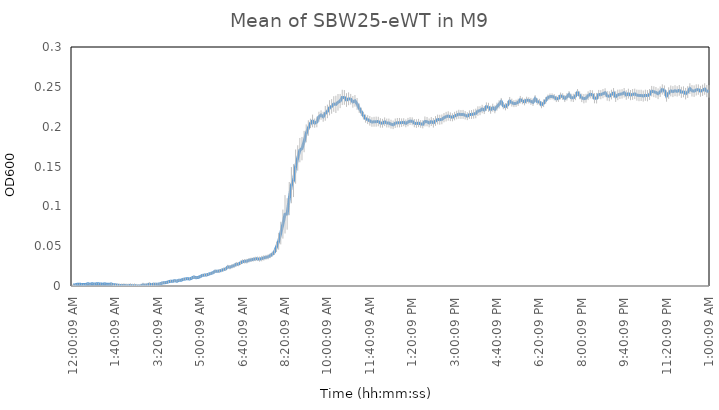
| Category | SBW25 (WT) |
|---|---|
| 0.00010416666666666667 | 0.001 |
| 0.0035763888888888894 | 0.001 |
| 0.0070486111111111105 | 0.002 |
| 0.010520833333333333 | 0.002 |
| 0.013993055555555555 | 0.002 |
| 0.017465277777777777 | 0.002 |
| 0.020937499999999998 | 0.002 |
| 0.02440972222222222 | 0.003 |
| 0.027881944444444445 | 0.002 |
| 0.03135416666666666 | 0.003 |
| 0.034826388888888886 | 0.002 |
| 0.03829861111111111 | 0.003 |
| 0.04177083333333333 | 0.003 |
| 0.04524305555555556 | 0.003 |
| 0.04871527777777778 | 0.002 |
| 0.0521875 | 0.003 |
| 0.05565972222222223 | 0.002 |
| 0.059131944444444445 | 0.002 |
| 0.06260416666666667 | 0.003 |
| 0.06607638888888889 | 0.001 |
| 0.06954861111111112 | 0.001 |
| 0.07302083333333333 | 0.001 |
| 0.07649305555555556 | 0.001 |
| 0.07996527777777777 | 0.001 |
| 0.0834375 | 0.001 |
| 0.08690972222222222 | 0 |
| 0.09038194444444443 | 0 |
| 0.09385416666666667 | 0.001 |
| 0.09732638888888889 | 0 |
| 0.1007986111111111 | 0 |
| 0.10427083333333333 | 0 |
| 0.10774305555555556 | 0 |
| 0.11121527777777777 | 0 |
| 0.1146875 | 0.001 |
| 0.11815972222222222 | 0.001 |
| 0.12163194444444443 | 0.001 |
| 0.12510416666666666 | 0.002 |
| 0.1285763888888889 | 0.002 |
| 0.1320486111111111 | 0.002 |
| 0.13552083333333334 | 0.002 |
| 0.13899305555555555 | 0.002 |
| 0.14246527777777776 | 0.003 |
| 0.1459375 | 0.004 |
| 0.14940972222222224 | 0.004 |
| 0.15288194444444445 | 0.004 |
| 0.15635416666666666 | 0.005 |
| 0.1598263888888889 | 0.006 |
| 0.1632986111111111 | 0.006 |
| 0.16677083333333334 | 0.007 |
| 0.17024305555555555 | 0.006 |
| 0.17371527777777776 | 0.007 |
| 0.17718750000000003 | 0.007 |
| 0.18065972222222224 | 0.008 |
| 0.18413194444444445 | 0.009 |
| 0.18760416666666666 | 0.009 |
| 0.1910763888888889 | 0.009 |
| 0.1945486111111111 | 0.01 |
| 0.1980208333333333 | 0.011 |
| 0.20149305555555555 | 0.01 |
| 0.20496527777777776 | 0.011 |
| 0.20843750000000003 | 0.012 |
| 0.21190972222222224 | 0.013 |
| 0.21538194444444445 | 0.014 |
| 0.21885416666666668 | 0.014 |
| 0.2223263888888889 | 0.015 |
| 0.2257986111111111 | 0.016 |
| 0.2292708333333333 | 0.017 |
| 0.23274305555555555 | 0.018 |
| 0.23621527777777776 | 0.018 |
| 0.23968749999999997 | 0.019 |
| 0.24315972222222224 | 0.02 |
| 0.24663194444444445 | 0.021 |
| 0.2501041666666667 | 0.021 |
| 0.2535763888888889 | 0.024 |
| 0.2570486111111111 | 0.024 |
| 0.26052083333333337 | 0.025 |
| 0.2639930555555556 | 0.026 |
| 0.2674652777777778 | 0.027 |
| 0.27092592592592596 | 0.027 |
| 0.2744097222222222 | 0.029 |
| 0.2778819444444444 | 0.031 |
| 0.2813541666666666 | 0.031 |
| 0.2848263888888889 | 0.031 |
| 0.2882986111111111 | 0.032 |
| 0.29177083333333337 | 0.033 |
| 0.2952430555555556 | 0.033 |
| 0.2987152777777778 | 0.034 |
| 0.3021875 | 0.034 |
| 0.3056597222222222 | 0.034 |
| 0.3091319444444444 | 0.034 |
| 0.3126041666666666 | 0.035 |
| 0.3160763888888889 | 0.036 |
| 0.3195486111111111 | 0.037 |
| 0.3230208333333333 | 0.038 |
| 0.3264930555555556 | 0.04 |
| 0.3299652777777778 | 0.043 |
| 0.3334375 | 0.049 |
| 0.3369097222222222 | 0.056 |
| 0.3403819444444445 | 0.066 |
| 0.3438541666666666 | 0.078 |
| 0.3473263888888889 | 0.09 |
| 0.35079861111111116 | 0.09 |
| 0.3542708333333333 | 0.11 |
| 0.3577430555555556 | 0.127 |
| 0.3612152777777778 | 0.132 |
| 0.3646875 | 0.15 |
| 0.3681597222222222 | 0.161 |
| 0.3716319444444445 | 0.171 |
| 0.3751041666666666 | 0.172 |
| 0.3785763888888889 | 0.181 |
| 0.38204861111111116 | 0.192 |
| 0.3855208333333333 | 0.198 |
| 0.3889930555555556 | 0.204 |
| 0.3924652777777778 | 0.207 |
| 0.3959375 | 0.204 |
| 0.3994097222222222 | 0.206 |
| 0.4028819444444445 | 0.212 |
| 0.4063541666666666 | 0.215 |
| 0.4098263888888889 | 0.212 |
| 0.41329861111111116 | 0.217 |
| 0.4167708333333333 | 0.219 |
| 0.4202430555555556 | 0.224 |
| 0.4237152777777778 | 0.225 |
| 0.4271875 | 0.228 |
| 0.4306597222222222 | 0.228 |
| 0.4341319444444445 | 0.231 |
| 0.4376041666666666 | 0.232 |
| 0.4410763888888889 | 0.237 |
| 0.44454861111111116 | 0.237 |
| 0.4480208333333333 | 0.233 |
| 0.4514930555555556 | 0.235 |
| 0.4549652777777778 | 0.234 |
| 0.4584375 | 0.231 |
| 0.4619097222222222 | 0.232 |
| 0.4653819444444445 | 0.229 |
| 0.4688541666666666 | 0.223 |
| 0.4723263888888889 | 0.219 |
| 0.47579861111111116 | 0.214 |
| 0.4792708333333333 | 0.21 |
| 0.4827430555555556 | 0.209 |
| 0.4862152777777778 | 0.207 |
| 0.4896875 | 0.206 |
| 0.4931597222222222 | 0.206 |
| 0.4966319444444445 | 0.206 |
| 0.5001041666666667 | 0.206 |
| 0.5035763888888889 | 0.205 |
| 0.5070486111111111 | 0.204 |
| 0.5105208333333333 | 0.206 |
| 0.5139930555555555 | 0.205 |
| 0.5174652777777778 | 0.205 |
| 0.5209374999999999 | 0.203 |
| 0.5244097222222223 | 0.202 |
| 0.5278819444444445 | 0.204 |
| 0.5313541666666667 | 0.205 |
| 0.5348263888888889 | 0.205 |
| 0.5382986111111111 | 0.205 |
| 0.5417708333333333 | 0.206 |
| 0.5452430555555555 | 0.204 |
| 0.5487152777777778 | 0.206 |
| 0.5521874999999999 | 0.207 |
| 0.5556597222222223 | 0.207 |
| 0.5591319444444445 | 0.204 |
| 0.5626041666666667 | 0.204 |
| 0.5660763888888889 | 0.205 |
| 0.5695486111111111 | 0.203 |
| 0.5730208333333333 | 0.203 |
| 0.5764930555555555 | 0.207 |
| 0.5799652777777778 | 0.206 |
| 0.5834374999999999 | 0.205 |
| 0.5869097222222223 | 0.206 |
| 0.5903819444444445 | 0.205 |
| 0.5938541666666667 | 0.207 |
| 0.5973263888888889 | 0.209 |
| 0.6007986111111111 | 0.209 |
| 0.6042708333333333 | 0.209 |
| 0.6077430555555555 | 0.211 |
| 0.6112152777777778 | 0.213 |
| 0.6146874999999999 | 0.213 |
| 0.6181597222222223 | 0.212 |
| 0.6216319444444445 | 0.212 |
| 0.6251041666666667 | 0.213 |
| 0.6285763888888889 | 0.215 |
| 0.6320486111111111 | 0.216 |
| 0.6355208333333333 | 0.215 |
| 0.6389930555555555 | 0.215 |
| 0.6424652777777778 | 0.214 |
| 0.6459374999999999 | 0.213 |
| 0.6494097222222223 | 0.215 |
| 0.6528819444444445 | 0.215 |
| 0.6563541666666667 | 0.216 |
| 0.6598263888888889 | 0.217 |
| 0.6632986111111111 | 0.22 |
| 0.6667708333333334 | 0.22 |
| 0.6702430555555555 | 0.222 |
| 0.6737152777777777 | 0.221 |
| 0.6771875 | 0.225 |
| 0.6806597222222223 | 0.224 |
| 0.6841319444444444 | 0.221 |
| 0.6876041666666667 | 0.224 |
| 0.6910763888888889 | 0.222 |
| 0.6945486111111111 | 0.225 |
| 0.6980208333333334 | 0.228 |
| 0.7014930555555555 | 0.231 |
| 0.7049652777777777 | 0.226 |
| 0.7084375 | 0.225 |
| 0.7119097222222223 | 0.227 |
| 0.7153819444444444 | 0.232 |
| 0.7188541666666667 | 0.23 |
| 0.7223263888888889 | 0.229 |
| 0.7257986111111111 | 0.229 |
| 0.7292708333333334 | 0.231 |
| 0.7327430555555555 | 0.234 |
| 0.7362152777777777 | 0.232 |
| 0.7396875 | 0.231 |
| 0.7431597222222223 | 0.233 |
| 0.7466319444444444 | 0.233 |
| 0.7501041666666667 | 0.232 |
| 0.7535763888888889 | 0.231 |
| 0.7570486111111111 | 0.235 |
| 0.7605208333333334 | 0.232 |
| 0.7639930555555555 | 0.231 |
| 0.7674652777777777 | 0.227 |
| 0.7709375 | 0.229 |
| 0.7744097222222223 | 0.233 |
| 0.7778819444444444 | 0.237 |
| 0.7813541666666667 | 0.238 |
| 0.7848263888888889 | 0.238 |
| 0.7882986111111111 | 0.237 |
| 0.7917708333333334 | 0.235 |
| 0.7952430555555555 | 0.235 |
| 0.7987152777777777 | 0.239 |
| 0.8021875 | 0.238 |
| 0.8056597222222223 | 0.235 |
| 0.8091319444444444 | 0.237 |
| 0.8126041666666667 | 0.24 |
| 0.8160763888888889 | 0.236 |
| 0.8195486111111111 | 0.236 |
| 0.8230208333333334 | 0.238 |
| 0.8264930555555555 | 0.243 |
| 0.8299652777777777 | 0.239 |
| 0.8334375 | 0.236 |
| 0.8369097222222223 | 0.235 |
| 0.8403819444444444 | 0.236 |
| 0.8438541666666667 | 0.239 |
| 0.8473263888888889 | 0.241 |
| 0.8507986111111111 | 0.24 |
| 0.8542708333333334 | 0.236 |
| 0.8577430555555555 | 0.236 |
| 0.8612152777777777 | 0.24 |
| 0.8646875 | 0.24 |
| 0.8681597222222223 | 0.241 |
| 0.8716319444444444 | 0.243 |
| 0.8751041666666667 | 0.239 |
| 0.8785763888888889 | 0.238 |
| 0.8820486111111111 | 0.24 |
| 0.8855208333333334 | 0.242 |
| 0.8889930555555555 | 0.238 |
| 0.8924652777777777 | 0.24 |
| 0.8959375 | 0.241 |
| 0.8994097222222223 | 0.241 |
| 0.9028819444444444 | 0.243 |
| 0.9063541666666667 | 0.24 |
| 0.9098263888888889 | 0.241 |
| 0.9132986111111111 | 0.24 |
| 0.9167708333333334 | 0.24 |
| 0.9202430555555555 | 0.241 |
| 0.9237152777777777 | 0.24 |
| 0.9271875 | 0.239 |
| 0.9306597222222223 | 0.239 |
| 0.9341319444444444 | 0.238 |
| 0.9376041666666667 | 0.239 |
| 0.9410763888888889 | 0.239 |
| 0.9445486111111111 | 0.24 |
| 0.9480208333333334 | 0.245 |
| 0.9514930555555555 | 0.244 |
| 0.9549652777777777 | 0.243 |
| 0.9584375 | 0.241 |
| 0.9619097222222223 | 0.244 |
| 0.9653819444444444 | 0.247 |
| 0.9688541666666667 | 0.245 |
| 0.9723263888888889 | 0.238 |
| 0.9757986111111111 | 0.242 |
| 0.9792708333333334 | 0.245 |
| 0.9827430555555555 | 0.244 |
| 0.9862152777777777 | 0.245 |
| 0.9896875 | 0.244 |
| 0.9931597222222223 | 0.246 |
| 0.9966319444444444 | 0.243 |
| 1900-01-01 00:00:09 | 0.244 |
| 1900-01-01 00:05:09 | 0.241 |
| 1900-01-01 00:10:09 | 0.243 |
| 1900-01-01 00:15:09 | 0.248 |
| 1900-01-01 00:20:09 | 0.245 |
| 1900-01-01 00:25:09 | 0.245 |
| 1900-01-01 00:30:09 | 0.246 |
| 1900-01-01 00:35:09 | 0.247 |
| 1900-01-01 00:40:09 | 0.244 |
| 1900-01-01 00:45:09 | 0.246 |
| 1900-01-01 00:50:09 | 0.247 |
| 1900-01-01 00:55:09 | 0.245 |
| 1900-01-01 01:00:09 | 0.244 |